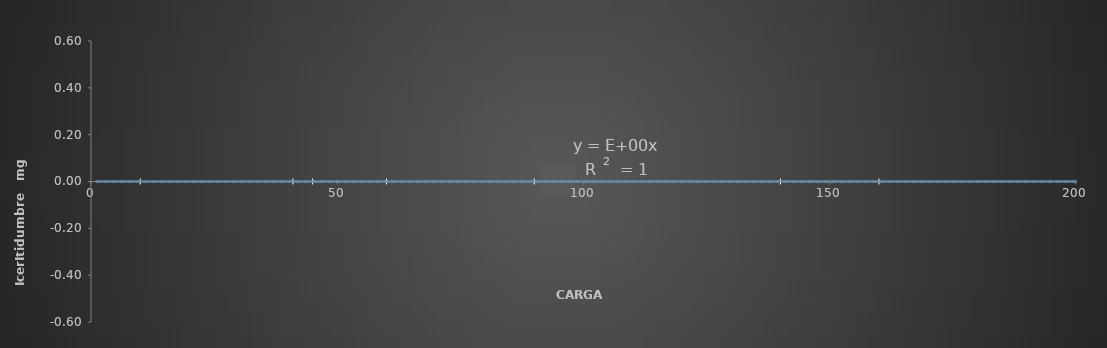
| Category | 1 |
|---|---|
| 1.0 | 0 |
| 5.0 | 0 |
| 50.0 | 0 |
| 100.0 | 0 |
| 200.0 | 0 |